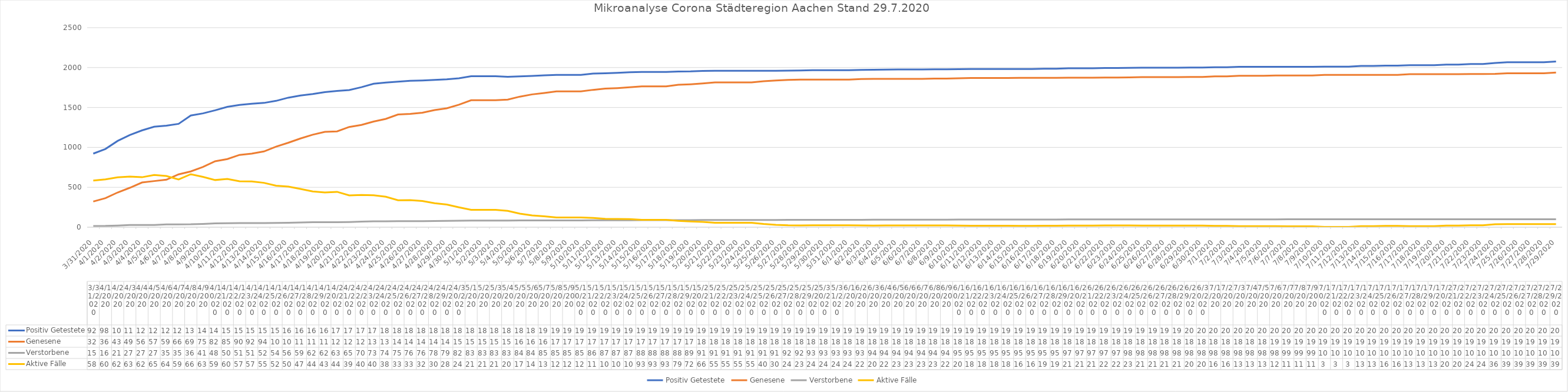
| Category | Positiv Getestete | Genesene | Verstorbene | Aktive Fälle |
|---|---|---|---|---|
| 3/31/20 | 922 | 322 | 15 | 585 |
| 4/1/20 | 980 | 364 | 16 | 600 |
| 4/2/20 | 1081 | 435 | 21 | 625 |
| 4/3/20 | 1155 | 494 | 27 | 634 |
| 4/4/20 | 1213 | 560 | 27 | 626 |
| 4/5/20 | 1259 | 578 | 27 | 654 |
| 4/6/20 | 1272 | 595 | 35 | 642 |
| 4/7/20 | 1295 | 662 | 35 | 598 |
| 4/8/20 | 1399 | 699 | 36 | 664 |
| 4/9/20 | 1426 | 755 | 41 | 630 |
| 4/10/20 | 1465 | 826 | 48 | 591 |
| 4/11/20 | 1508 | 854 | 50 | 604 |
| 4/12/20 | 1532 | 906 | 51 | 575 |
| 4/13/20 | 1547 | 922 | 51 | 574 |
| 4/14/20 | 1557 | 949 | 52 | 556 |
| 4/15/20 | 1583 | 1009 | 54 | 520 |
| 4/16/20 | 1623 | 1058 | 56 | 509 |
| 4/17/20 | 1650 | 1112 | 59 | 479 |
| 4/18/20 | 1669 | 1159 | 62 | 448 |
| 4/19/20 | 1693 | 1195 | 62 | 436 |
| 4/20/20 | 1707 | 1201 | 63 | 443 |
| 4/21/20 | 1719 | 1256 | 65 | 398 |
| 4/22/20 | 1754 | 1281 | 70 | 403 |
| 4/23/20 | 1797 | 1324 | 73 | 400 |
| 4/24/20 | 1812 | 1357 | 74 | 381 |
| 4/25/20 | 1824 | 1412 | 75 | 337 |
| 4/26/20 | 1835 | 1420 | 76 | 339 |
| 4/27/20 | 1839 | 1435 | 76 | 328 |
| 4/28/20 | 1845 | 1467 | 78 | 300 |
| 4/29/20 | 1853 | 1490 | 79 | 284 |
| 4/30/20 | 1866 | 1535 | 82 | 249 |
| 5/1/20 | 1891 | 1591 | 83 | 217 |
| 5/2/20 | 1891 | 1591 | 83 | 217 |
| 5/3/20 | 1891 | 1591 | 83 | 217 |
| 5/4/20 | 1885 | 1598 | 83 | 204 |
| 5/5/20 | 1890 | 1636 | 84 | 170 |
| 5/6/20 | 1895 | 1664 | 84 | 147 |
| 5/7/20 | 1903 | 1682 | 85 | 136 |
| 5/8/20 | 1909 | 1702 | 85 | 122 |
| 5/9/20 | 1909 | 1702 | 85 | 122 |
| 5/10/20 | 1909 | 1702 | 85 | 122 |
| 5/11/20 | 1924 | 1721 | 86 | 117 |
| 5/12/20 | 1929 | 1736 | 87 | 106 |
| 5/13/20 | 1934 | 1743 | 87 | 104 |
| 5/14/20 | 1941 | 1753 | 87 | 101 |
| 5/15/20 | 1945 | 1764 | 88 | 93 |
| 5/16/20 | 1945 | 1764 | 88 | 93 |
| 5/17/20 | 1945 | 1764 | 88 | 93 |
| 5/18/20 | 1951 | 1784 | 88 | 79 |
| 5/19/20 | 1952 | 1791 | 89 | 72 |
| 5/20/20 | 1958 | 1801 | 91 | 66 |
| 5/21/20 | 1960 | 1814 | 91 | 55 |
| 5/22/20 | 1960 | 1814 | 91 | 55 |
| 5/23/20 | 1960 | 1814 | 91 | 55 |
| 5/24/20 | 1960 | 1814 | 91 | 55 |
| 5/25/20 | 1960 | 1829 | 91 | 40 |
| 5/26/20 | 1960 | 1839 | 91 | 30 |
| 5/27/20 | 1962 | 1846 | 92 | 24 |
| 5/28/20 | 1964 | 1849 | 92 | 23 |
| 5/29/20 | 1967 | 1850 | 93 | 24 |
| 5/30/20 | 1967 | 1850 | 93 | 24 |
| 5/31/20 | 1967 | 1850 | 93 | 24 |
| 6/1/20 | 1967 | 1850 | 93 | 24 |
| 6/2/20 | 1971 | 1856 | 93 | 22 |
| 6/3/20 | 1972 | 1858 | 94 | 20 |
| 6/4/20 | 1975 | 1859 | 94 | 22 |
| 6/5/20 | 1976 | 1859 | 94 | 23 |
| 6/6/20 | 1976 | 1859 | 94 | 23 |
| 6/7/20 | 1976 | 1859 | 94 | 23 |
| 6/8/20 | 1979 | 1862 | 94 | 23 |
| 6/9/20 | 1979 | 1863 | 94 | 22 |
| 6/10/20 | 1980 | 1865 | 95 | 20 |
| 6/11/20 | 1982 | 1869 | 95 | 18 |
| 6/12/20 | 1982 | 1869 | 95 | 18 |
| 6/13/20 | 1982 | 1869 | 95 | 18 |
| 6/14/20 | 1982 | 1869 | 95 | 18 |
| 6/15/20 | 1982 | 1871 | 95 | 16 |
| 6/16/20 | 1982 | 1871 | 95 | 16 |
| 6/17/20 | 1985 | 1871 | 95 | 19 |
| 6/18/20 | 1985 | 1871 | 95 | 19 |
| 6/19/20 | 1991 | 1873 | 97 | 21 |
| 6/20/20 | 1991 | 1873 | 97 | 21 |
| 6/21/20 | 1991 | 1873 | 97 | 21 |
| 6/22/20 | 1994 | 1875 | 97 | 22 |
| 6/23/20 | 1994 | 1875 | 97 | 22 |
| 6/24/20 | 1997 | 1876 | 98 | 23 |
| 6/25/20 | 1999 | 1880 | 98 | 21 |
| 6/26/20 | 1999 | 1880 | 98 | 21 |
| 6/27/20 | 1999 | 1880 | 98 | 21 |
| 6/28/20 | 1999 | 1880 | 98 | 21 |
| 6/29/20 | 2001 | 1883 | 98 | 20 |
| 6/30/20 | 2001 | 1883 | 98 | 20 |
| 7/1/20 | 2004 | 1890 | 98 | 16 |
| 7/2/20 | 2004 | 1890 | 98 | 16 |
| 7/3/20 | 2009 | 1898 | 98 | 13 |
| 7/4/20 | 2009 | 1898 | 98 | 13 |
| 7/5/20 | 2009 | 1898 | 98 | 13 |
| 7/6/20 | 2010 | 1900 | 98 | 12 |
| 7/7/20 | 2010 | 1900 | 99 | 11 |
| 7/8/20 | 2010 | 1900 | 99 | 11 |
| 7/9/20 | 2010 | 1900 | 99 | 11 |
| 7/10/20 | 2011 | 1908 | 100 | 3 |
| 7/11/20 | 2011 | 1908 | 100 | 3 |
| 7/12/20 | 2011 | 1908 | 100 | 3 |
| 7/13/20 | 2021 | 1908 | 100 | 13 |
| 7/14/20 | 2021 | 1908 | 100 | 13 |
| 7/15/20 | 2025 | 1909 | 100 | 16 |
| 7/16/20 | 2025 | 1909 | 100 | 16 |
| 7/17/20 | 2030 | 1917 | 100 | 13 |
| 7/18/20 | 2030 | 1917 | 100 | 13 |
| 7/19/20 | 2030 | 1917 | 100 | 13 |
| 7/20/20 | 2037 | 1917 | 100 | 20 |
| 7/21/20 | 2037 | 1917 | 100 | 20 |
| 7/22/20 | 2044 | 1920 | 100 | 24 |
| 7/23/20 | 2044 | 1920 | 100 | 24 |
| 7/24/20 | 2058 | 1922 | 100 | 36 |
| 7/25/20 | 2067 | 1928 | 100 | 39 |
| 7/26/20 | 2067 | 1928 | 100 | 39 |
| 7/27/20 | 2067 | 1928 | 100 | 39 |
| 7/28/20 | 2067 | 1928 | 100 | 39 |
| 7/29/20 | 2076 | 1937 | 100 | 39 |